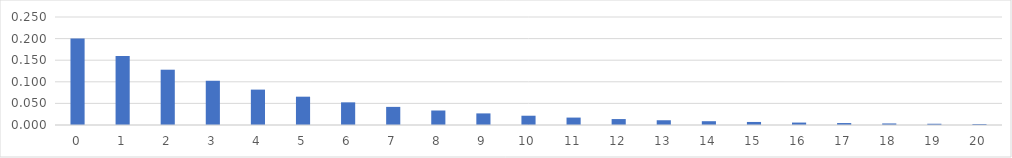
| Category | Series 0 |
|---|---|
| 0.0 | 0.2 |
| 1.0 | 0.16 |
| 2.0 | 0.128 |
| 3.0 | 0.102 |
| 4.0 | 0.082 |
| 5.0 | 0.066 |
| 6.0 | 0.052 |
| 7.0 | 0.042 |
| 8.0 | 0.034 |
| 9.0 | 0.027 |
| 10.0 | 0.021 |
| 11.0 | 0.017 |
| 12.0 | 0.014 |
| 13.0 | 0.011 |
| 14.0 | 0.009 |
| 15.0 | 0.007 |
| 16.0 | 0.006 |
| 17.0 | 0.005 |
| 18.0 | 0.004 |
| 19.0 | 0.003 |
| 20.0 | 0.002 |